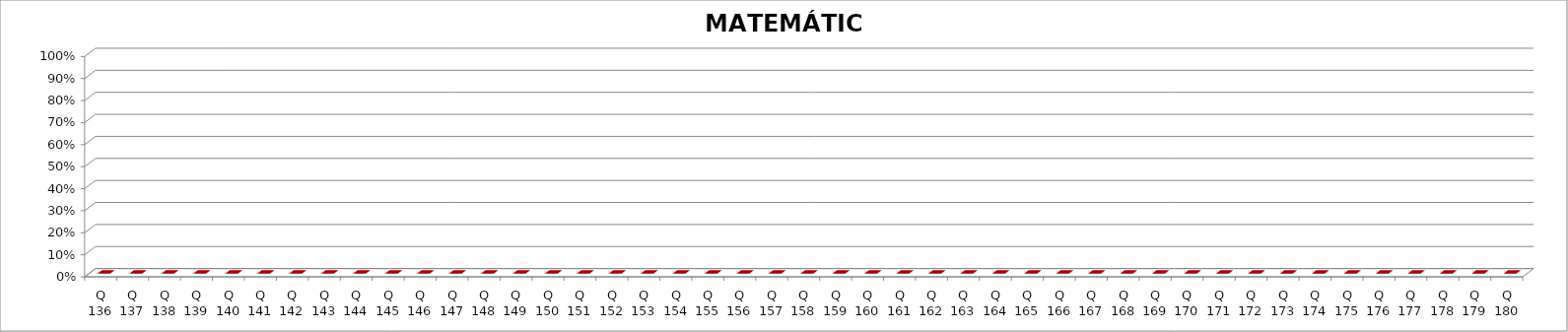
| Category | MATEMÁTICA |
|---|---|
| Q 136 | 0 |
| Q 137 | 0 |
| Q 138 | 0 |
| Q 139 | 0 |
| Q 140 | 0 |
| Q 141 | 0 |
| Q 142 | 0 |
| Q 143 | 0 |
| Q 144 | 0 |
| Q 145 | 0 |
| Q 146 | 0 |
| Q 147 | 0 |
| Q 148 | 0 |
| Q 149 | 0 |
| Q 150 | 0 |
| Q 151 | 0 |
| Q 152 | 0 |
| Q 153 | 0 |
| Q 154 | 0 |
| Q 155 | 0 |
| Q 156 | 0 |
| Q 157 | 0 |
| Q 158 | 0 |
| Q 159 | 0 |
| Q 160 | 0 |
| Q 161 | 0 |
| Q 162 | 0 |
| Q 163 | 0 |
| Q 164 | 0 |
| Q 165 | 0 |
| Q 166 | 0 |
| Q 167 | 0 |
| Q 168 | 0 |
| Q 169 | 0 |
| Q 170 | 0 |
| Q 171 | 0 |
| Q 172 | 0 |
| Q 173 | 0 |
| Q 174 | 0 |
| Q 175 | 0 |
| Q 176 | 0 |
| Q 177 | 0 |
| Q 178 | 0 |
| Q 179 | 0 |
| Q 180 | 0 |